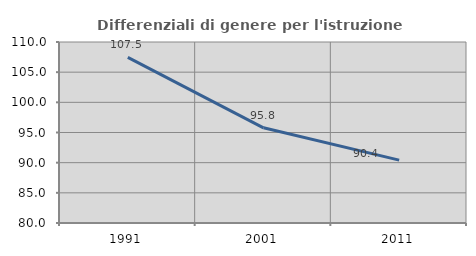
| Category | Differenziali di genere per l'istruzione superiore |
|---|---|
| 1991.0 | 107.453 |
| 2001.0 | 95.774 |
| 2011.0 | 90.422 |